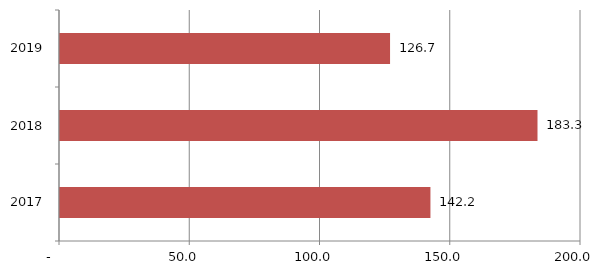
| Category | Series 0 |
|---|---|
| 2017.0 | 142.2 |
| 2018.0 | 183.3 |
| 2019.0 | 126.7 |